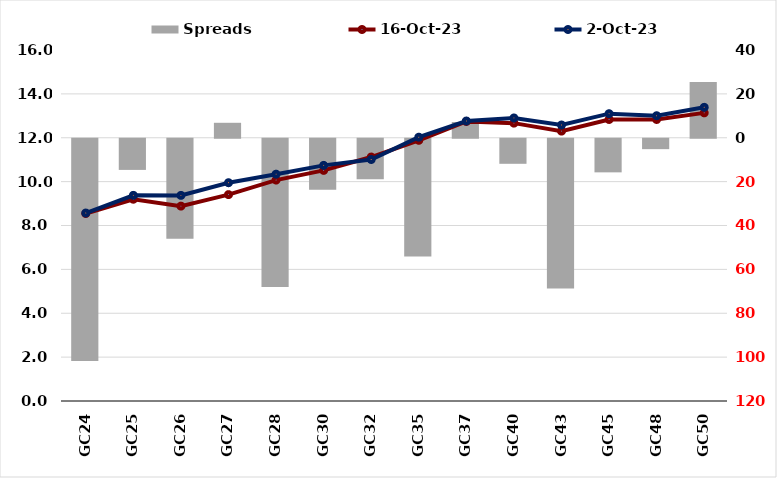
| Category |  Spreads   |
|---|---|
| GC24 | -101.269 |
| GC25 | -14.203 |
| GC26 | -45.63 |
| GC27 | 6.817 |
| GC28 | -67.551 |
| GC30 | -23.302 |
| GC32 | -18.411 |
| GC35 | -53.709 |
| GC37 | 7.182 |
| GC40 | -11.417 |
| GC43 | -68.231 |
| GC45 | -15.32 |
| GC48 | -4.739 |
| GC50 | 25.465 |